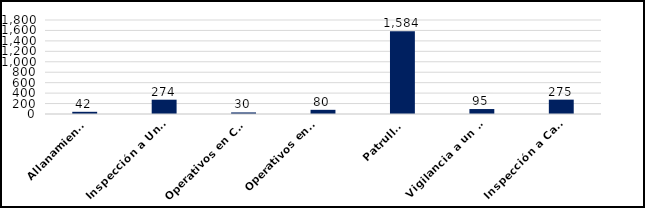
| Category | Series 0 |
|---|---|
| Allanamientos | 42 |
| Inspección a Unidades que transportan Combustibles y Mercancias  | 274 |
| Operativos en Comisión Mixta Interinstitucional | 30 |
| Operativos en Apoyo a la DSCEEC 
 | 80 |
| Patrullas | 1584 |
| Vigilancia a un Punto de Interés  | 95 |
| Inspección a Camiones de Desechos Oleosos | 275 |